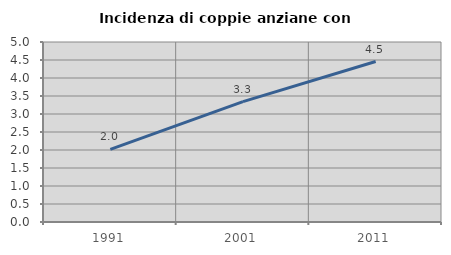
| Category | Incidenza di coppie anziane con figli |
|---|---|
| 1991.0 | 2.015 |
| 2001.0 | 3.344 |
| 2011.0 | 4.457 |